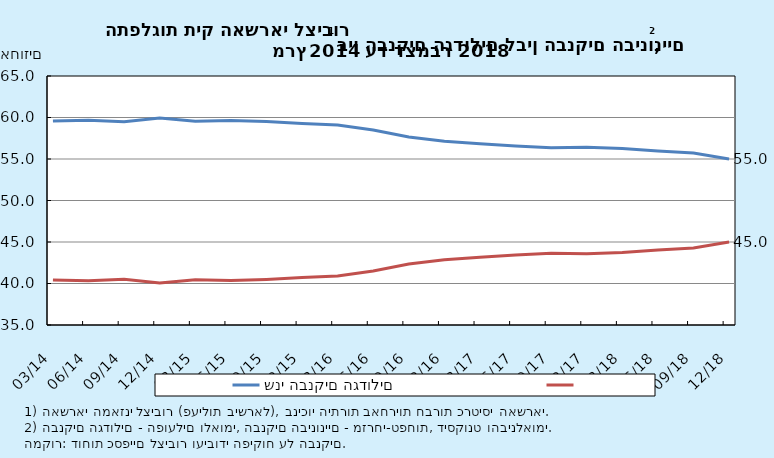
| Category | שני הבנקים הגדולים | Series 1 |
|---|---|---|
| 2014-03-31 | 59.575 | 40.425 |
| 2014-06-30 | 59.667 | 40.333 |
| 2014-09-30 | 59.49 | 40.51 |
| 2014-12-31 | 59.925 | 40.075 |
| 2015-03-31 | 59.535 | 40.465 |
| 2015-06-30 | 59.649 | 40.351 |
| 2015-09-30 | 59.509 | 40.491 |
| 2015-12-31 | 59.284 | 40.716 |
| 2016-03-31 | 59.094 | 40.906 |
| 2016-06-30 | 58.498 | 41.502 |
| 2016-09-30 | 57.656 | 42.344 |
| 2016-12-31 | 57.126 | 42.874 |
| 2017-03-31 | 56.824 | 43.176 |
| 2017-06-30 | 56.563 | 43.437 |
| 2017-09-30 | 56.352 | 43.648 |
| 2017-12-31 | 56.422 | 43.578 |
| 2018-03-31 | 56.262 | 43.738 |
| 2018-06-30 | 55.953 | 44.047 |
| 2018-09-30 | 55.716 | 44.284 |
| 2018-12-31 | 55.003 | 44.997 |